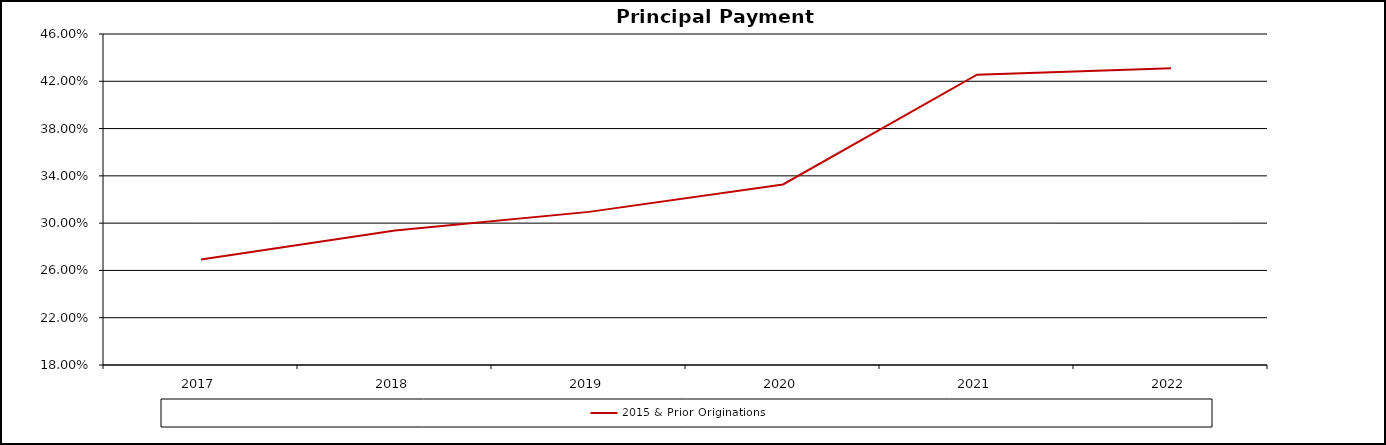
| Category | 2015 & Prior Originations |
|---|---|
| 2017.0 | 0.269 |
| 2018.0 | 0.294 |
| 2019.0 | 0.31 |
| 2020.0 | 0.333 |
| 2021.0 | 0.426 |
| 2022.0 | 0.431 |